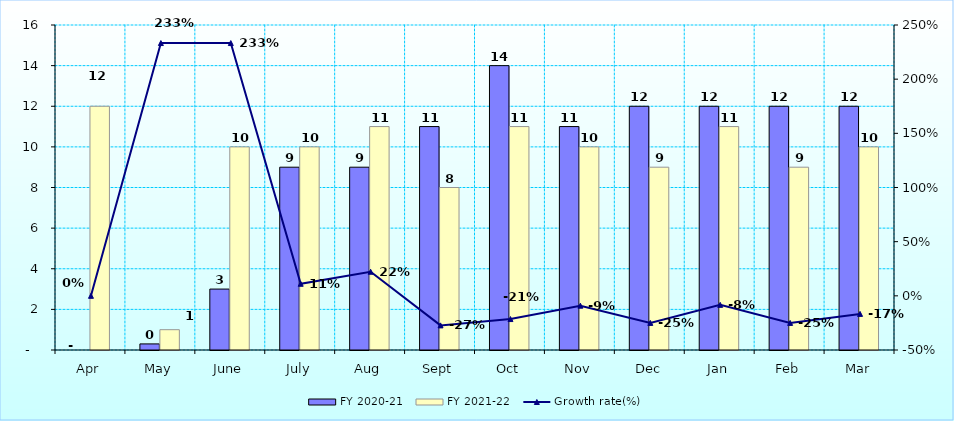
| Category | FY 2020-21 | FY 2021-22 |
|---|---|---|
| Apr | 0 | 12 |
| May | 0.3 | 1 |
| June | 3 | 10 |
| July | 9 | 10 |
| Aug | 9 | 11 |
| Sept | 11 | 8 |
| Oct | 14 | 11 |
| Nov | 11 | 10 |
| Dec | 12 | 9 |
| Jan | 12 | 11 |
| Feb | 12 | 9 |
| Mar | 12 | 10 |